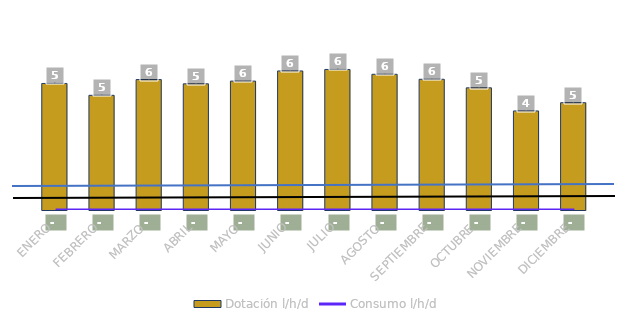
| Category | Dotación l/h/d |
|---|---|
| ENERO | 5.401 |
| FEBRERO | 4.895 |
| MARZO | 5.566 |
| ABRIL | 5.385 |
| MAYO | 5.502 |
| JUNIO | 5.935 |
| JULIO | 5.999 |
| AGOSTO | 5.793 |
| SEPTIEMBRE | 5.58 |
| OCTUBRE | 5.214 |
| NOVIEMBRE | 4.228 |
| DICIEMBRE | 4.579 |